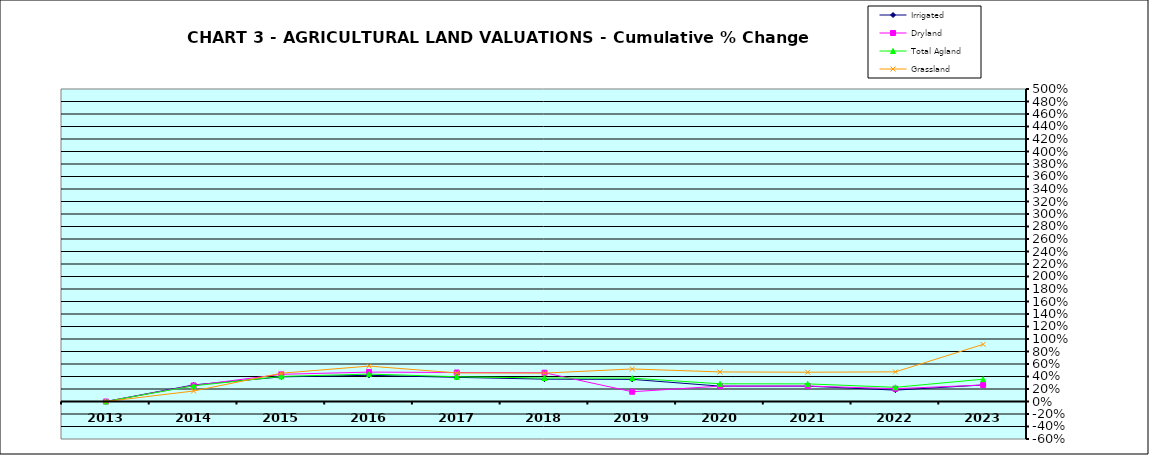
| Category | Irrigated | Dryland | Total Agland | Grassland |
|---|---|---|---|---|
| 2013.0 | 0 | 0 | 0 | 0 |
| 2014.0 | 0.265 | 0.256 | 0.251 | 0.168 |
| 2015.0 | 0.394 | 0.435 | 0.401 | 0.453 |
| 2016.0 | 0.419 | 0.47 | 0.439 | 0.567 |
| 2017.0 | 0.386 | 0.464 | 0.396 | 0.457 |
| 2018.0 | 0.357 | 0.46 | 0.376 | 0.455 |
| 2019.0 | 0.354 | 0.156 | 0.374 | 0.521 |
| 2020.0 | 0.246 | 0.246 | 0.283 | 0.473 |
| 2021.0 | 0.245 | 0.248 | 0.282 | 0.468 |
| 2022.0 | 0.182 | 0.205 | 0.227 | 0.474 |
| 2023.0 | 0.264 | 0.264 | 0.357 | 0.914 |